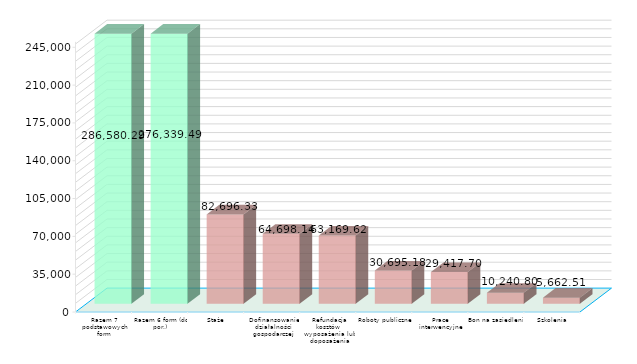
| Category | KOSZTY (w tys. zł.) |
|---|---|
| Razem 7 podstawowych form | 286580.288 |
| Razem 6 form (do por.) | 276339.488 |
| Staże | 82696.333 |
| Dofinansowanie działalności gospodarczej | 64698.141 |
| Refundacja kosztów wyposażenia lub doposażenia miejsca pracy | 63169.621 |
| Roboty publiczne | 30695.179 |
| Prace interwencyjne | 29417.7 |
| Bon na zasiedlenie | 10240.801 |
| Szkolenia | 5662.513 |